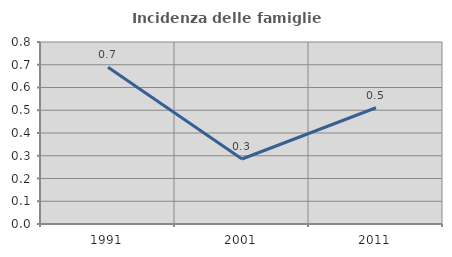
| Category | Incidenza delle famiglie numerose |
|---|---|
| 1991.0 | 0.689 |
| 2001.0 | 0.286 |
| 2011.0 | 0.511 |